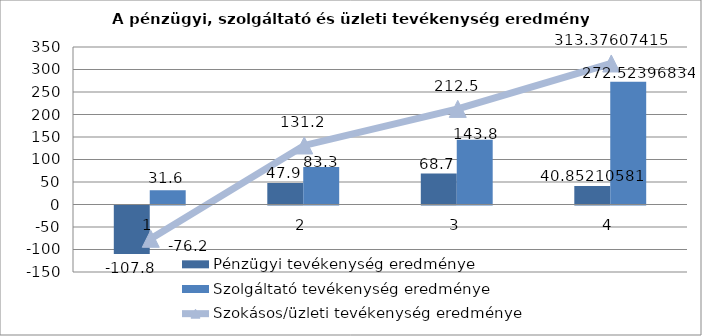
| Category | Pénzügyi tevékenység eredménye | Szolgáltató tevékenység eredménye |
|---|---|---|
| 2012. év | -107.8 | 31.6 |
| 2013. év | 47.9 | 83.3 |
| 2014. év | 68.7 | 143.8 |
| 2015. év | 40.852 | 272.524 |